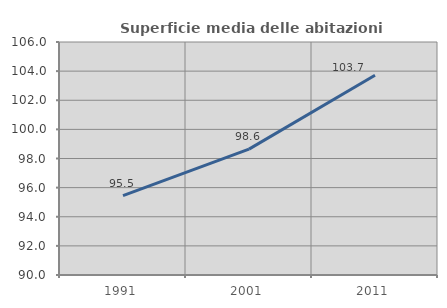
| Category | Superficie media delle abitazioni occupate |
|---|---|
| 1991.0 | 95.457 |
| 2001.0 | 98.647 |
| 2011.0 | 103.718 |